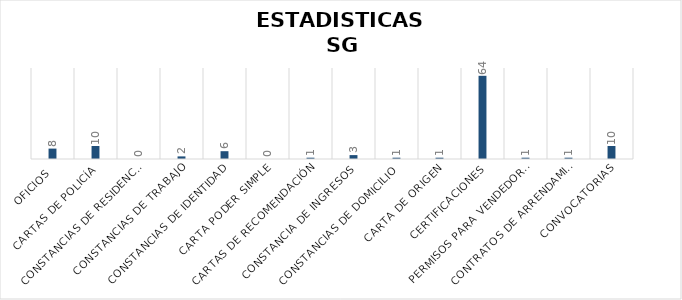
| Category | CANTIDAD |
|---|---|
| Oficios | 8 |
| Cartas de Policía | 10 |
| Constancias de residencia  | 0 |
| Constancias de trabajo | 2 |
| Constancias de identidad | 6 |
| Carta poder simple | 0 |
| Cartas de recomendación | 1 |
| Constancia de ingresos | 3 |
| Constancias de domicilio | 1 |
| Carta de origen | 1 |
| Certificaciones | 64 |
| Permisos para vendedores | 1 |
| Contratos de arrendamiento | 1 |
| Convocatorias | 10 |